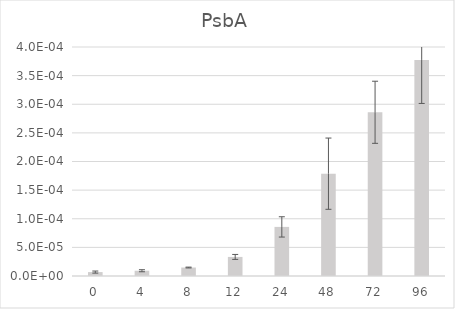
| Category | Series 0 |
|---|---|
| 0.0 | 0 |
| 4.0 | 0 |
| 8.0 | 0 |
| 12.0 | 0 |
| 24.0 | 0 |
| 48.0 | 0 |
| 72.0 | 0 |
| 96.0 | 0 |